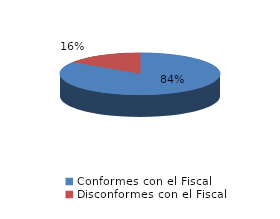
| Category | Series 0 |
|---|---|
| 0 | 43 |
| 1 | 8 |